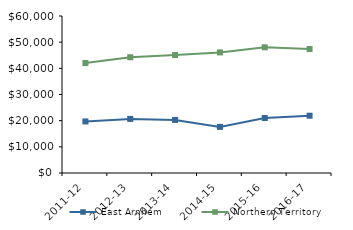
| Category | East Arnhem | Northern Territory |
|---|---|---|
| 2011-12 | 19704.43 | 42021 |
| 2012-13 | 20660.1 | 44232.02 |
| 2013-14 | 20277.78 | 45075.51 |
| 2014-15 | 17621.39 | 46083.65 |
| 2015-16 | 21025.94 | 48046.27 |
| 2016-17 | 21893.92 | 47367.05 |